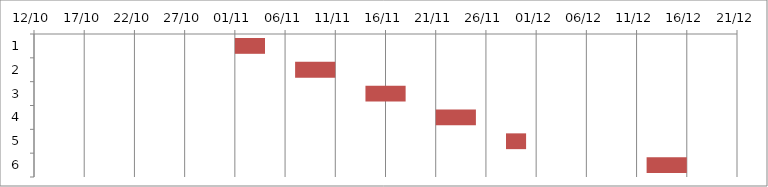
| Category | Fecha de inicio | DURACIÓN |
|---|---|---|
| 0 | 11/1/16 | 3 |
| 1 | 11/7/16 | 4 |
| 2 | 11/14/16 | 4 |
| 3 | 11/21/16 | 4 |
| 4 | 11/28/16 | 2 |
| 5 | 12/12/16 | 4 |